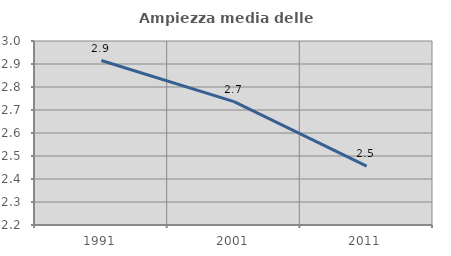
| Category | Ampiezza media delle famiglie |
|---|---|
| 1991.0 | 2.915 |
| 2001.0 | 2.736 |
| 2011.0 | 2.456 |